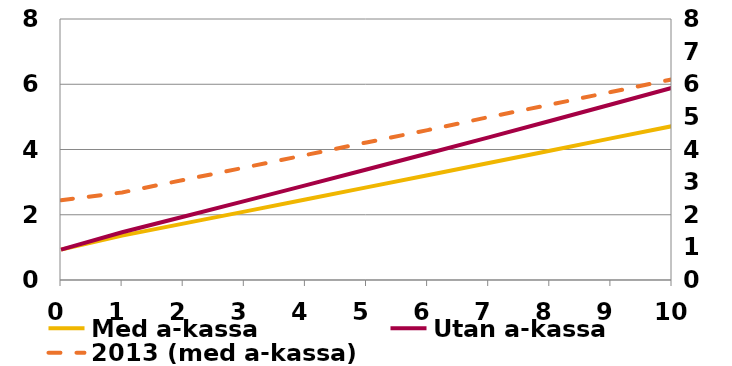
| Category | Med a-kassa |
|---|---|
| 0.0 | 0.931 |
| 1.0 | 1.359 |
| 2.0 | 1.729 |
| 3.0 | 2.096 |
| 4.0 | 2.47 |
| 5.0 | 2.838 |
| 6.0 | 3.212 |
| 7.0 | 3.584 |
| 8.0 | 3.962 |
| 9.0 | 4.34 |
| 10.0 | 4.716 |